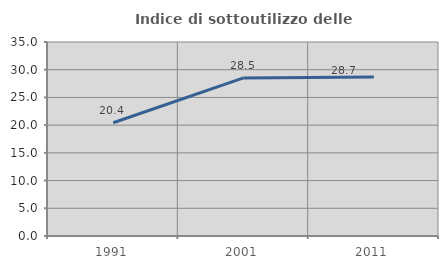
| Category | Indice di sottoutilizzo delle abitazioni  |
|---|---|
| 1991.0 | 20.433 |
| 2001.0 | 28.522 |
| 2011.0 | 28.672 |